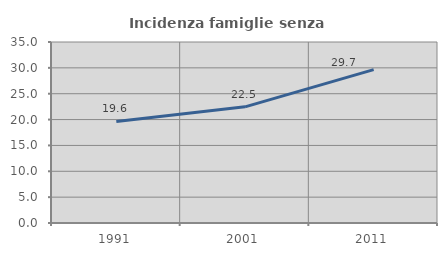
| Category | Incidenza famiglie senza nuclei |
|---|---|
| 1991.0 | 19.646 |
| 2001.0 | 22.458 |
| 2011.0 | 29.65 |